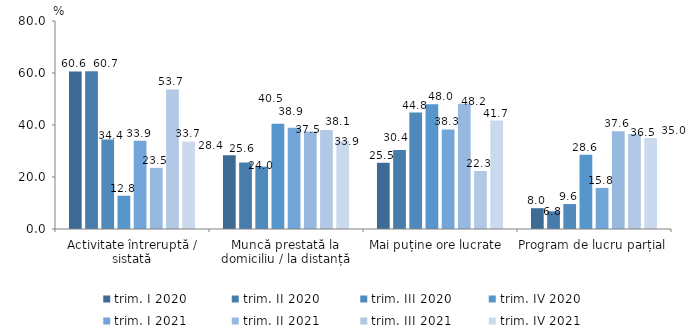
| Category | trim. I 2020 | trim. II 2020 | trim. III 2020 | trim. IV 2020 | trim. I 2021 | trim. II 2021 | trim. III 2021 | trim. IV 2021 |
|---|---|---|---|---|---|---|---|---|
| Activitate întreruptă / sistată | 60.6 | 60.7 | 34.4 | 12.8 | 33.9 | 23.5 | 53.7 | 33.7 |
| Muncă prestată la domiciliu / la distanță | 28.4 | 25.6 | 24 | 40.5 | 38.9 | 37.5 | 38.1 | 33.9 |
| Mai puține ore lucrate  | 25.5 | 30.4 | 44.8 | 48 | 38.3 | 48.2 | 22.3 | 41.7 |
| Program de lucru parțial | 8 | 6.8 | 9.6 | 28.6 | 15.8 | 37.6 | 36.5 | 35 |